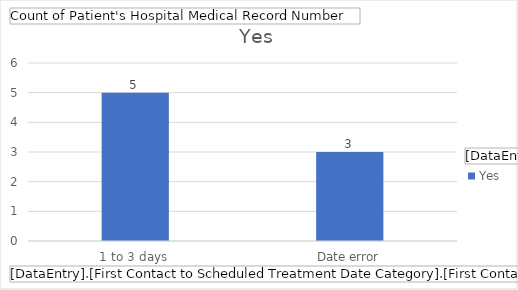
| Category | Yes |
|---|---|
| 1 to 3 days | 5 |
| Date error | 3 |